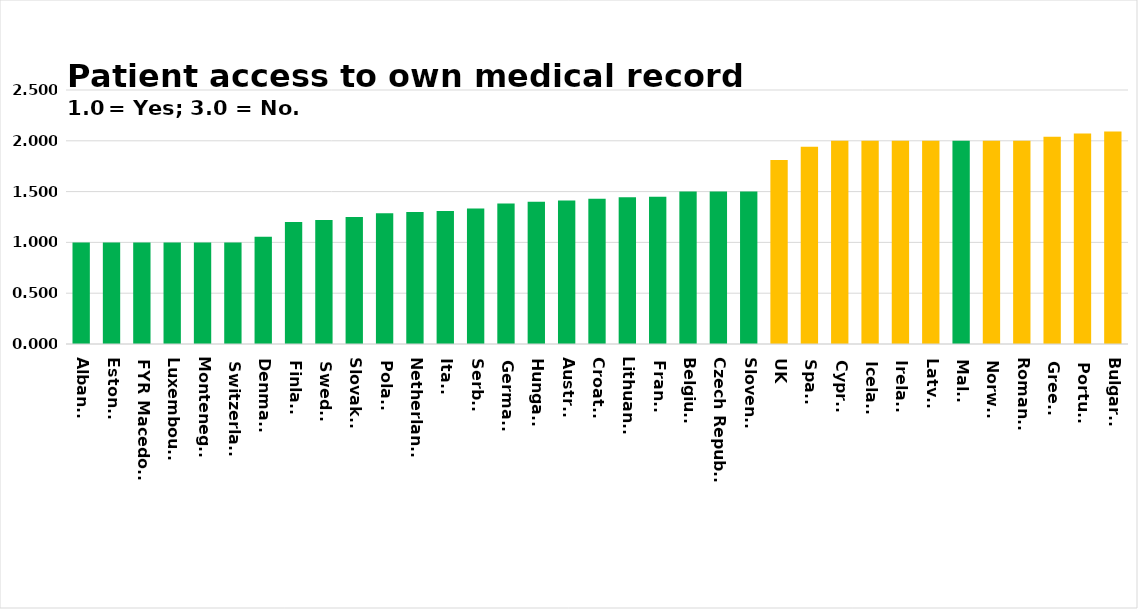
| Category | Series 0 |
|---|---|
| Albania | 1 |
| Estonia | 1 |
| FYR Macedonia | 1 |
| Luxembourg | 1 |
| Montenegro | 1 |
| Switzerland  | 1 |
| Denmark | 1.056 |
| Finland | 1.2 |
| Sweden | 1.22 |
| Slovakia | 1.25 |
| Poland | 1.286 |
| Netherlands | 1.3 |
| Italy | 1.31 |
| Serbia | 1.333 |
| Germany | 1.383 |
| Hungary | 1.4 |
| Austria | 1.412 |
| Croatia | 1.429 |
| Lithuania | 1.444 |
| France | 1.448 |
| Belgium | 1.5 |
| Czech Republic | 1.5 |
| Slovenia | 1.5 |
| UK | 1.81 |
| Spain | 1.94 |
| Cyprus | 2 |
| Iceland | 2 |
| Ireland | 2 |
| Latvia | 2 |
| Malta | 2 |
| Norway | 2 |
| Romania | 2 |
| Greece | 2.04 |
| Portugal | 2.071 |
| Bulgaria | 2.091 |